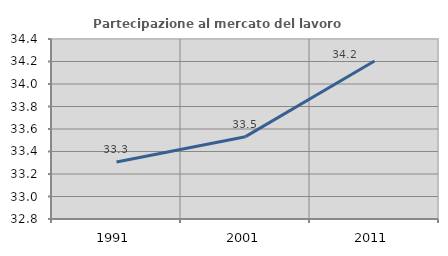
| Category | Partecipazione al mercato del lavoro  femminile |
|---|---|
| 1991.0 | 33.308 |
| 2001.0 | 33.532 |
| 2011.0 | 34.204 |